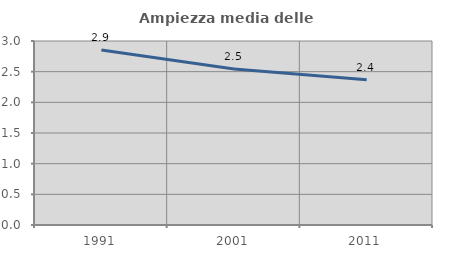
| Category | Ampiezza media delle famiglie |
|---|---|
| 1991.0 | 2.852 |
| 2001.0 | 2.545 |
| 2011.0 | 2.369 |